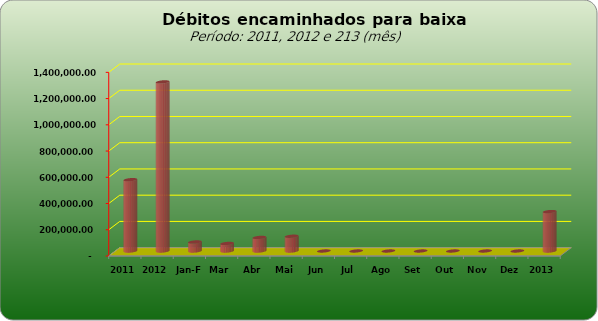
| Category |  543.796,20   1.288.982,12   68.983,48   57.649,63   103.629,52   112.546,24   -     -     -     -     -     -     -     300.618,22  |
|---|---|
| 2011 | 543796.2 |
| 2012 | 1288982.12 |
| Jan-Fev | 68983.48 |
| Mar | 57649.63 |
| Abr | 103629.52 |
| Mai | 112546.24 |
| Jun | 0 |
| Jul | 0 |
| Ago | 0 |
| Set | 0 |
| Out | 0 |
| Nov | 0 |
| Dez | 0 |
| 2013 | 300618.22 |